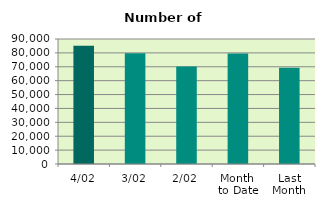
| Category | Series 0 |
|---|---|
| 4/02 | 85084 |
| 3/02 | 79686 |
| 2/02 | 70242 |
| Month 
to Date | 79622.5 |
| Last
Month | 69227.8 |